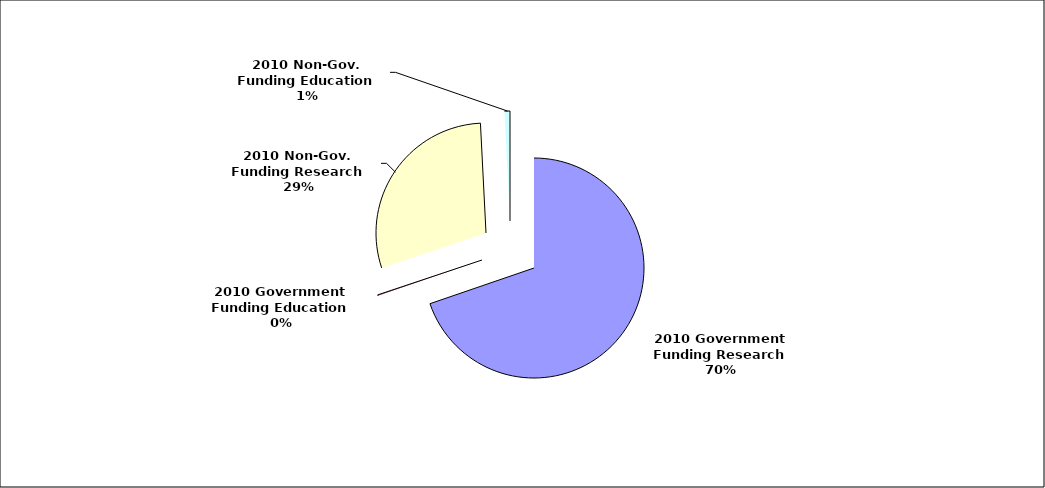
| Category | Series 0 |
|---|---|
| Government Funding Rec'd Research | 175794679 |
| Government Funding Rec'd Education | 317950 |
| Non-Gov. Funding Rec'd Research | 73932144 |
| Non-Gov. Funding Rec'd Education | 2029910 |